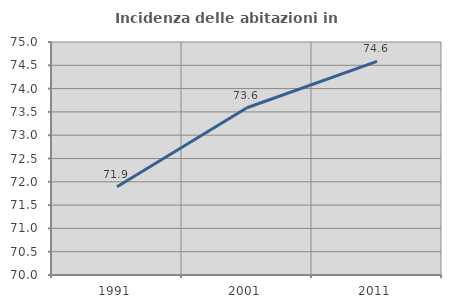
| Category | Incidenza delle abitazioni in proprietà  |
|---|---|
| 1991.0 | 71.895 |
| 2001.0 | 73.589 |
| 2011.0 | 74.586 |